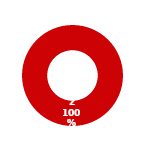
| Category | ISC |
|---|---|
| MIL 1 Complete | 0 |
| MIL 1 Not Complete | 2 |